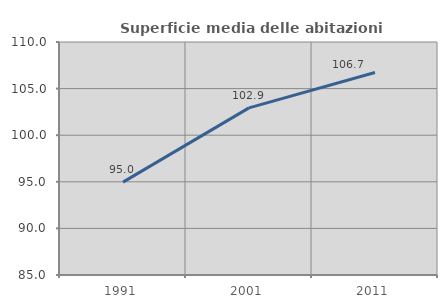
| Category | Superficie media delle abitazioni occupate |
|---|---|
| 1991.0 | 94.964 |
| 2001.0 | 102.928 |
| 2011.0 | 106.723 |